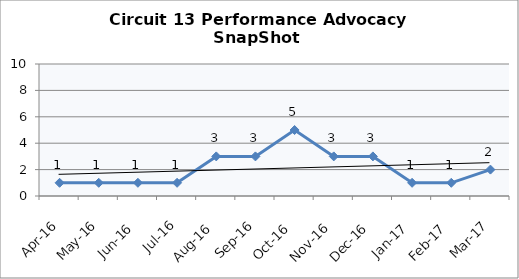
| Category | Circuit 13 |
|---|---|
| Apr-16 | 1 |
| May-16 | 1 |
| Jun-16 | 1 |
| Jul-16 | 1 |
| Aug-16 | 3 |
| Sep-16 | 3 |
| Oct-16 | 5 |
| Nov-16 | 3 |
| Dec-16 | 3 |
| Jan-17 | 1 |
| Feb-17 | 1 |
| Mar-17 | 2 |